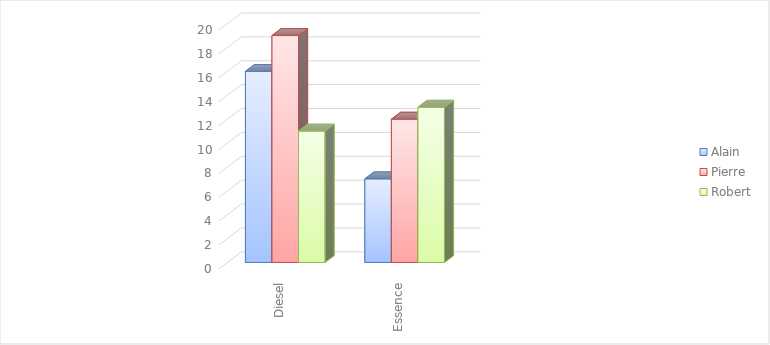
| Category | Alain | Pierre | Robert |
|---|---|---|---|
| Diesel | 16 | 19 | 11 |
| Essence | 7 | 12 | 13 |